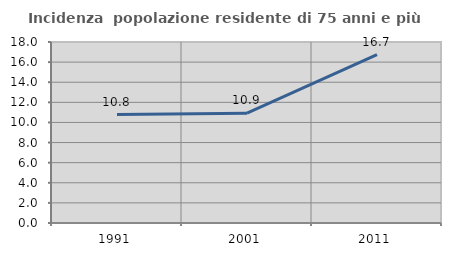
| Category | Incidenza  popolazione residente di 75 anni e più |
|---|---|
| 1991.0 | 10.778 |
| 2001.0 | 10.918 |
| 2011.0 | 16.747 |